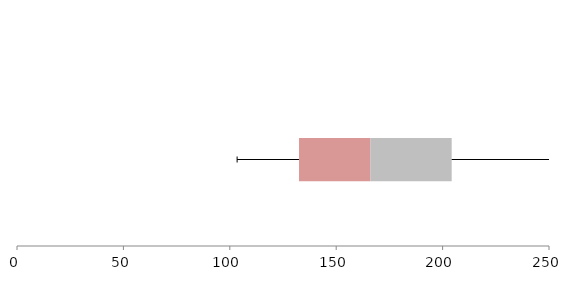
| Category | Series 1 | Series 2 | Series 3 |
|---|---|---|---|
| 0 | 132.533 | 33.574 | 38.166 |